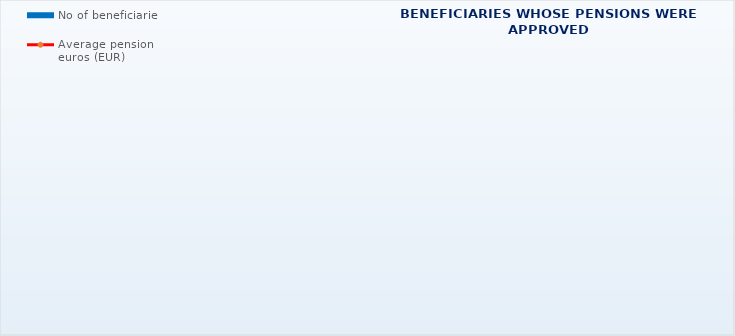
| Category | No of beneficiaries |
|---|---|
| Authorised officials in internal affairs, judicial officers and workers engaged in demining work: | 17183 |
| Pension beneficiaries entitled under the Fire Services Act (Official Gazette 125/19) | 388 |
| Active military personnel - DVO  | 16169 |
| Croatian Homeland Army veterans mobilised from 1941 to 1945 | 1680 |
| Former political prisoners | 1980 |
| Croatian Veterans from the Homeland War - ZOHBDR (Act on Croatian Homeland War Veterans and Their Family Members) | 71481 |
| Pensions approved under general regulations and determined according to the Act on the Rights of Croatian Homeland War Veterans and their Family Members (ZOHBDR), in 2017 (Art. 27, 35, 48 and 49, paragraph 2)    | 59515 |
| Former Yugoslav People's Army members - JNA   | 3416 |
| Former Yugoslav People's Army members - JNA - Art. 185 of Pension Insurance Act (ZOMO)  | 153 |
| National Liberation War veterans - NOR | 4500 |
| Members of the Croatian Parliament, members of the Government, judges of the Constitutional Court and the Auditor General | 685 |
| Members of the Parliamentary Executive Council and administratively retired federal civil servants  (relates to the former SFRY) | 61 |
| Former officials of federal bodies o the former SFRJ -  Article 38 of the Pension Insurance Act (ZOMO) | 17 |
| Full members of the Croatian Academy of Sciences and Arts - HAZU | 121 |
| Miners from the Istrian coal mines "Tupljak" d.d. Labin  | 244 |
| Workers professionally exposed to asbestos | 810 |
| Insurees - crew members on a ship in international and national navigation  - Article  129, paragraph 2 of the Maritime Code | 207 |
| Pension beneficiaries entitled according to the Theaters Act (Official Gazette 23/23) | 2 |
| Members of the Croatian Defence Council - HVO  | 7231 |